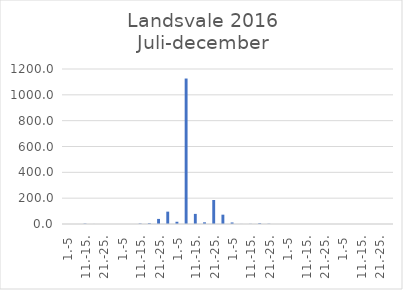
| Category | Series 0 |
|---|---|
| 1.-5 | 0 |
| 6.-10. | 0.116 |
| 11.-15. | 3 |
| 16.-20. | 0.34 |
| 21.-25. | 0 |
| 26.-31. | 0 |
| 1.-5 | 0 |
| 6.-10. | 0.11 |
| 11.-15. | 3.798 |
| 16.-20. | 6 |
| 21.-25. | 39.368 |
| 26.-31. | 95.701 |
| 1.-5 | 17.376 |
| 6.-10. | 1126.233 |
| 11.-15. | 78.255 |
| 16.-20. | 12.997 |
| 21.-25. | 185.864 |
| 26.-30. | 72.211 |
| 1.-5 | 11.878 |
| 6.-10. | 0.482 |
| 11.-15. | 1.294 |
| 16.-20. | 5.958 |
| 21.-25. | 2.066 |
| 26.-31. | 0.072 |
| 1.-5 | 0.023 |
| 6.-10. | 0 |
| 11.-15. | 0 |
| 16.-20. | 0 |
| 21.-25. | 0 |
| 26.-30. | 0 |
| 1.-5 | 0 |
| 6.-10. | 0 |
| 11.-15. | 0 |
| 16.-20. | 0 |
| 21.-25. | 0 |
| 26.-31. | 0 |